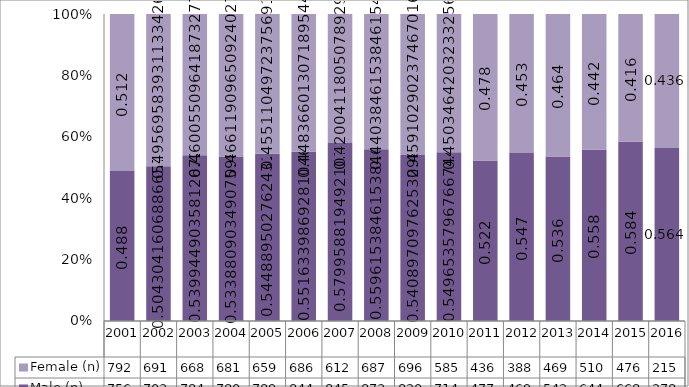
| Category | Male (n) | Female (n) |
|---|---|---|
| 2001.0 | 756 | 792 |
| 2002.0 | 703 | 691 |
| 2003.0 | 784 | 668 |
| 2004.0 | 780 | 681 |
| 2005.0 | 789 | 659 |
| 2006.0 | 844 | 686 |
| 2007.0 | 845 | 612 |
| 2008.0 | 873 | 687 |
| 2009.0 | 820 | 696 |
| 2010.0 | 714 | 585 |
| 2011.0 | 477 | 436 |
| 2012.0 | 469 | 388 |
| 2013.0 | 542 | 469 |
| 2014.0 | 644 | 510 |
| 2015.0 | 668 | 476 |
| 2016.0 | 278 | 215 |